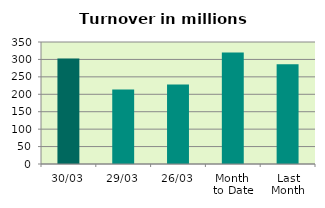
| Category | Series 0 |
|---|---|
| 30/03 | 302.961 |
| 29/03 | 213.573 |
| 26/03 | 228.302 |
| Month 
to Date | 319.787 |
| Last
Month | 285.972 |